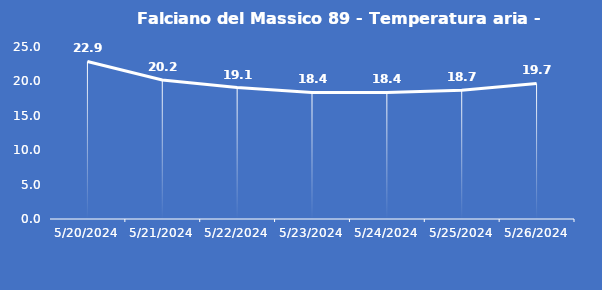
| Category | Falciano del Massico 89 - Temperatura aria - Grezzo (°C) |
|---|---|
| 5/20/24 | 22.9 |
| 5/21/24 | 20.2 |
| 5/22/24 | 19.1 |
| 5/23/24 | 18.4 |
| 5/24/24 | 18.4 |
| 5/25/24 | 18.7 |
| 5/26/24 | 19.7 |